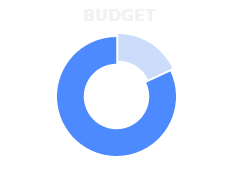
| Category | Series 0 |
|---|---|
| 0 | 0.819 |
| 1 | 0.181 |